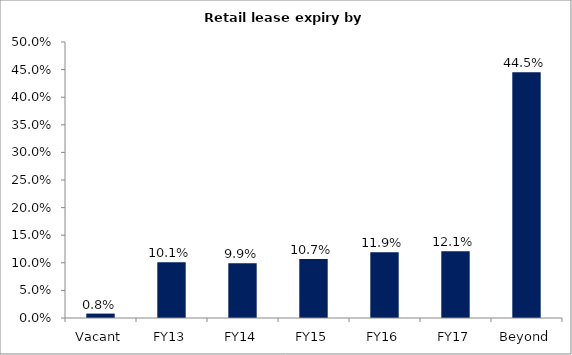
| Category | Series 0 |
|---|---|
| Vacant | 0.008 |
| FY13 | 0.101 |
| FY14 | 0.099 |
| FY15 | 0.107 |
| FY16 | 0.119 |
| FY17 | 0.121 |
| Beyond | 0.445 |